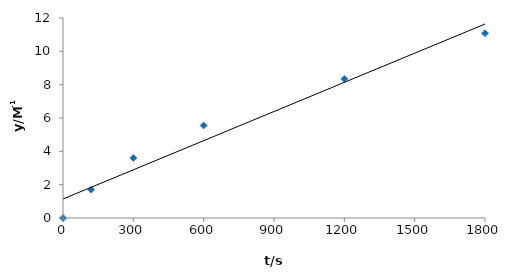
| Category | Series 0 |
|---|---|
| 0.0 | 0 |
| 120.0 | 1.702 |
| 300.0 | 3.603 |
| 600.0 | 5.553 |
| 1200.0 | 8.345 |
| 1800.0 | 11.086 |